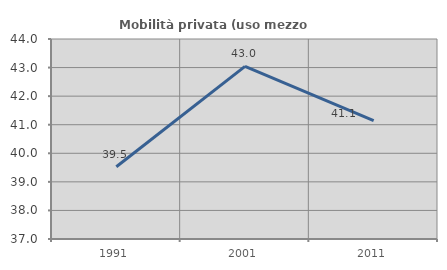
| Category | Mobilità privata (uso mezzo privato) |
|---|---|
| 1991.0 | 39.528 |
| 2001.0 | 43.043 |
| 2011.0 | 41.143 |